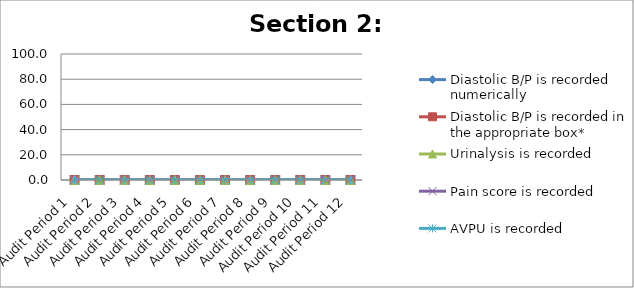
| Category | Diastolic B/P is recorded numerically | Diastolic B/P is recorded in the appropriate box* | Urinalysis is recorded | Pain score is recorded | AVPU is recorded  |
|---|---|---|---|---|---|
| Audit Period 1 | 0 | 0 | 0 | 0 | 0 |
| Audit Period 2 | 0 | 0 | 0 | 0 | 0 |
| Audit Period 3 | 0 | 0 | 0 | 0 | 0 |
| Audit Period 4 | 0 | 0 | 0 | 0 | 0 |
| Audit Period 5 | 0 | 0 | 0 | 0 | 0 |
| Audit Period 6 | 0 | 0 | 0 | 0 | 0 |
| Audit Period 7 | 0 | 0 | 0 | 0 | 0 |
| Audit Period 8 | 0 | 0 | 0 | 0 | 0 |
| Audit Period 9 | 0 | 0 | 0 | 0 | 0 |
| Audit Period 10 | 0 | 0 | 0 | 0 | 0 |
| Audit Period 11 | 0 | 0 | 0 | 0 | 0 |
| Audit Period 12 | 0 | 0 | 0 | 0 | 0 |